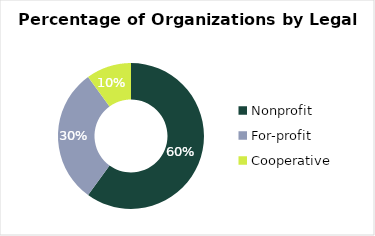
| Category | Total |
|---|---|
| Nonprofit | 0.6 |
| For-profit | 0.3 |
| Cooperative | 0.1 |